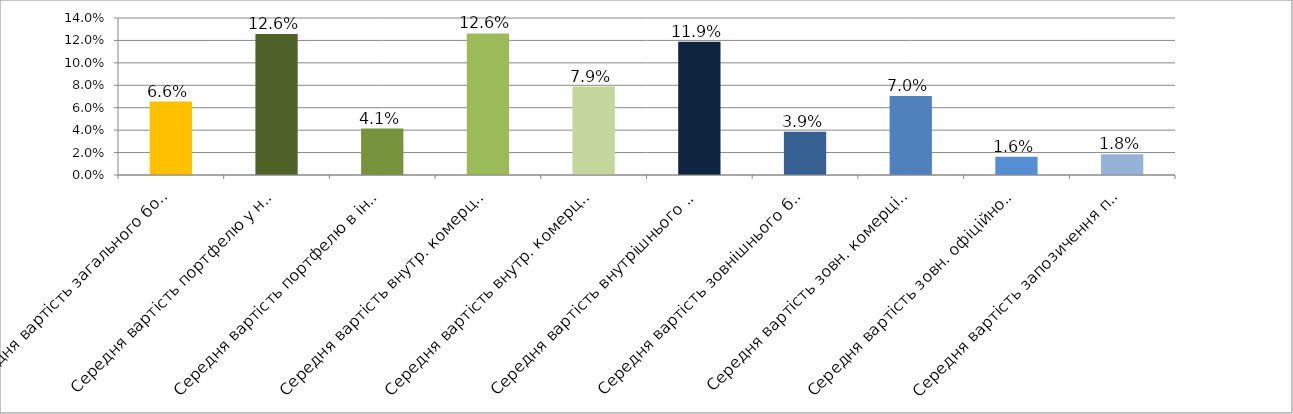
| Category | Series 0 |
|---|---|
| Середня вартість загального боргового портфелю | 0.066 |
| Середня вартість портфелю у нац.валюті | 0.126 |
| Середня вартість портфелю в іноземній валюті | 0.041 |
| Середня вартість внутр. комерційного портфелю в нац.валюті | 0.126 |
| Середня вартість внутр. комерційного портфелю в іноземній валюті | 0.079 |
| Середня вартість внутрішнього боргового портфелю | 0.119 |
| Середня вартість зовнішнього боргового портфелю | 0.039 |
| Середня вартість зовн. комерційного портфелю в іноземній валюті | 0.07 |
| Середня вартість зовн. офіційного портфелю в іноземній валюті | 0.016 |
| Середня вартість запозичення під держгарантії США в іноземній валюті | 0.018 |